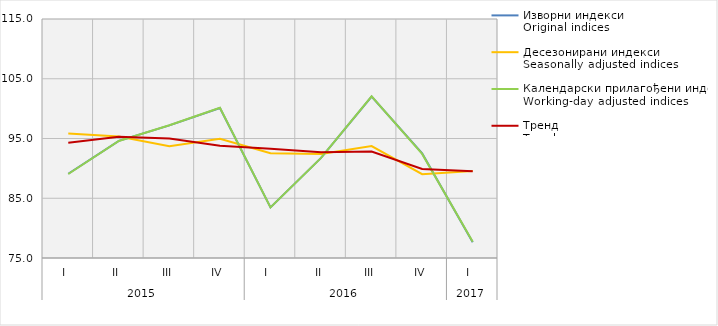
| Category | Изворни индекси
Original indices | Десезонирани индекси
Seasonally adjusted indices | Календарски прилагођени индекси
Working-day adjusted indices | Тренд
Trend |
|---|---|---|---|---|
| 0 | 89.1 | 95.822 | 89.062 | 94.307 |
| 1 | 94.6 | 95.316 | 94.58 | 95.273 |
| 2 | 97.2 | 93.722 | 97.229 | 95.004 |
| 3 | 100.1 | 94.967 | 100.135 | 93.801 |
| 4 | 83.476 | 92.549 | 83.476 | 93.28 |
| 5 | 91.763 | 92.405 | 91.763 | 92.695 |
| 6 | 102.022 | 93.735 | 102.068 | 92.836 |
| 7 | 92.509 | 89.036 | 92.417 | 89.899 |
| 8 | 77.626 | 89.546 | 77.719 | 89.536 |